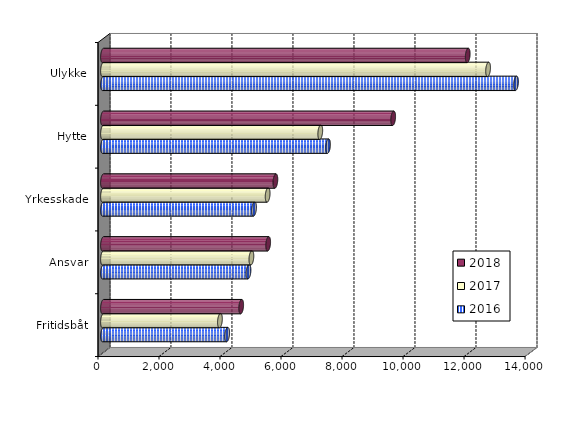
| Category | 2016 | 2017 | 2018 |
|---|---|---|---|
| Fritidsbåt | 4070.67 | 3833.546 | 4529.924 |
| Ansvar | 4769.704 | 4864.401 | 5414.37 |
| Yrkesskade | 4950.777 | 5397.574 | 5650.922 |
| Hytte | 7377.228 | 7122.066 | 9512.477 |
| Ulykke | 13539.56 | 12623.589 | 11956.072 |